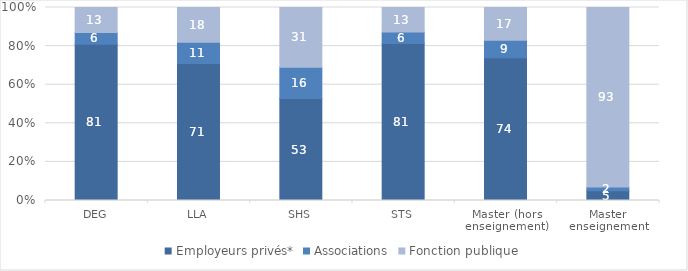
| Category | Employeurs privés* | Associations | Fonction publique |
|---|---|---|---|
| DEG | 81.09 | 6 | 13 |
| LLA | 71 | 11 | 18 |
| SHS | 53 | 16.34 | 31 |
| STS | 81 | 6 | 12.61 |
| Master (hors enseignement) | 74 | 9 | 17 |
| Master enseignement | 5 | 2.06 | 93 |